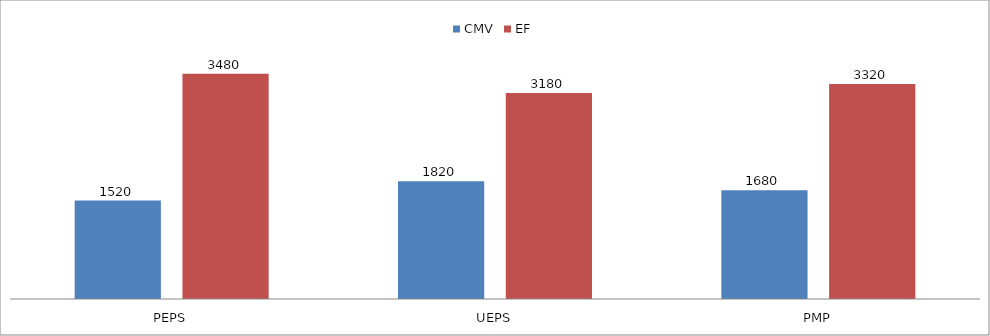
| Category | CMV | EF |
|---|---|---|
| PEPS | 1520 | 3480 |
| UEPS | 1820 | 3180 |
| PMP | 1680 | 3320 |